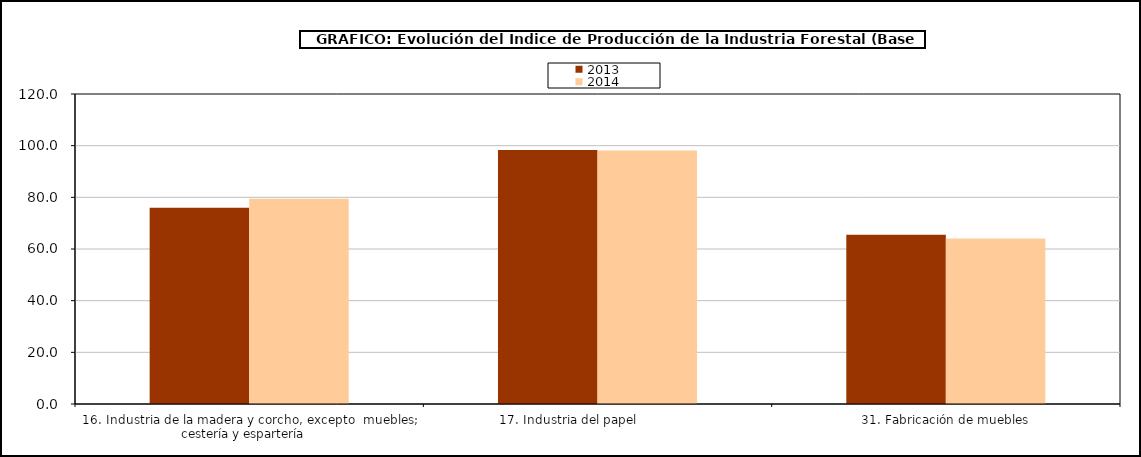
| Category | 2013 | 2014 |
|---|---|---|
| 16. Industria de la madera y corcho, excepto  muebles; cestería y espartería    | 76.003 | 79.424 |
| 17. Industria del papel                | 98.337 | 98.096 |
| 31. Fabricación de muebles | 65.548 | 64.109 |